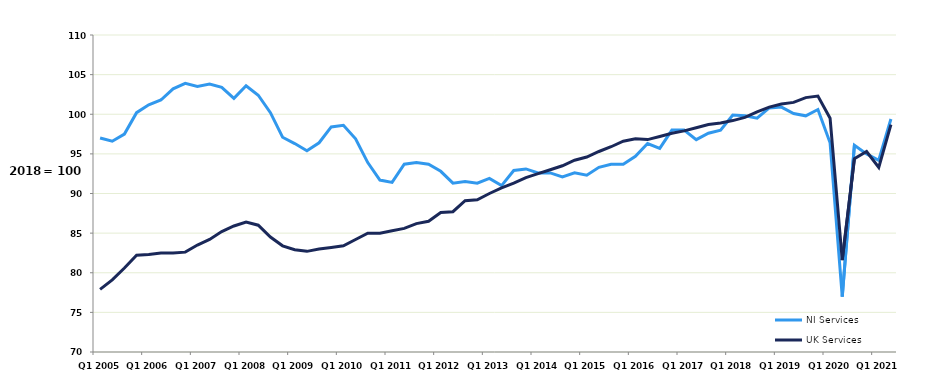
| Category | NI Services | UK Services |
|---|---|---|
| Q1 2005 | 97 | 77.9 |
|  | 96.6 | 79.1 |
|  | 97.5 | 80.6 |
|  | 100.2 | 82.2 |
| Q1 2006 | 101.2 | 82.3 |
|  | 101.8 | 82.5 |
|  | 103.2 | 82.5 |
|  | 103.9 | 82.6 |
| Q1 2007 | 103.5 | 83.5 |
|  | 103.8 | 84.2 |
|  | 103.4 | 85.2 |
|  | 102 | 85.9 |
| Q1 2008 | 103.6 | 86.4 |
|  | 102.4 | 86 |
|  | 100.2 | 84.5 |
|  | 97.1 | 83.4 |
| Q1 2009 | 96.3 | 82.9 |
|  | 95.4 | 82.7 |
|  | 96.4 | 83 |
|  | 98.4 | 83.2 |
| Q1 2010 | 98.6 | 83.4 |
|  | 96.9 | 84.2 |
|  | 93.9 | 85 |
|  | 91.7 | 85 |
| Q1 2011 | 91.4 | 85.3 |
|  | 93.7 | 85.6 |
|  | 93.9 | 86.2 |
|  | 93.7 | 86.5 |
| Q1 2012 | 92.8 | 87.6 |
|  | 91.3 | 87.7 |
|  | 91.5 | 89.1 |
|  | 91.3 | 89.2 |
| Q1 2013 | 91.9 | 90 |
|  | 91 | 90.7 |
|  | 92.9 | 91.3 |
|  | 93.1 | 92 |
| Q1 2014 | 92.6 | 92.5 |
|  | 92.6 | 93 |
|  | 92.1 | 93.5 |
|  | 92.6 | 94.2 |
| Q1 2015 | 92.3 | 94.6 |
|  | 93.3 | 95.3 |
|  | 93.7 | 95.9 |
|  | 93.7 | 96.6 |
| Q1 2016 | 94.7 | 96.9 |
|  | 96.3 | 96.8 |
|  | 95.7 | 97.2 |
|  | 98 | 97.6 |
| Q1 2017 | 98 | 97.9 |
|  | 96.8 | 98.3 |
|  | 97.6 | 98.7 |
|  | 98 | 98.9 |
| Q1 2018 | 99.9 | 99.2 |
|  | 99.8 | 99.6 |
|  | 99.5 | 100.3 |
|  | 100.8 | 100.9 |
| Q1 2019 | 100.9 | 101.3 |
|  | 100.1 | 101.5 |
|  | 99.8 | 102.1 |
|  | 100.6 | 102.3 |
| Q1 2020 | 96.4 | 99.5 |
|  | 77 | 81.6 |
|  | 96.1 | 94.4 |
|  | 95 | 95.3 |
| Q1 2021 | 94.2 | 93.3 |